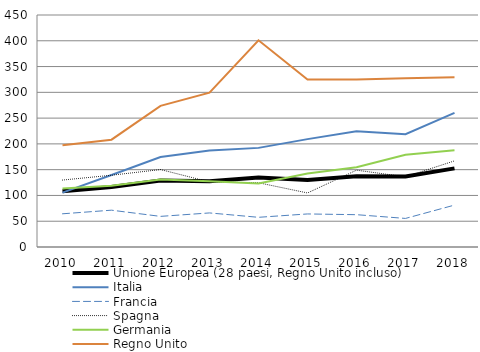
| Category | Unione Europea (28 paesi, Regno Unito incluso) | Italia  | Francia  | Spagna  | Germania  | Regno Unito |
|---|---|---|---|---|---|---|
| 2010.0 | 108.103 | 105.521 | 64.403 | 129.841 | 113.5 | 197.2 |
| 2011.0 | 116.182 | 139.622 | 71.41 | 139.208 | 118.688 | 208.177 |
| 2012.0 | 128.884 | 174.485 | 59.398 | 150.196 | 130.899 | 273.712 |
| 2013.0 | 127.597 | 187.391 | 66.083 | 126.179 | 127.548 | 299.301 |
| 2014.0 | 135.024 | 192.269 | 57.578 | 124.604 | 123.114 | 400.97 |
| 2015.0 | 130.105 | 209.248 | 64.112 | 104.818 | 142.591 | 324.918 |
| 2016.0 | 137.323 | 224.42 | 62.685 | 149.031 | 154.532 | 324.751 |
| 2017.0 | 136.916 | 218.661 | 55.43 | 136.165 | 178.899 | 327.466 |
| 2018.0 | 152.486 | 260.011 | 81.29 | 167.052 | 187.617 | 329.041 |